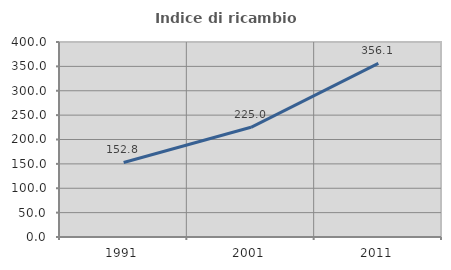
| Category | Indice di ricambio occupazionale  |
|---|---|
| 1991.0 | 152.823 |
| 2001.0 | 225 |
| 2011.0 | 356.118 |